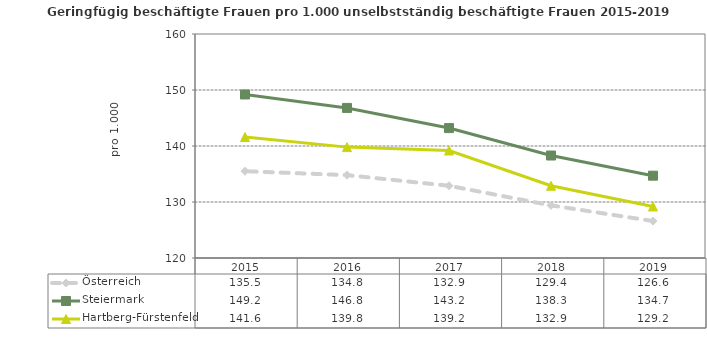
| Category | Österreich | Steiermark | Hartberg-Fürstenfeld |
|---|---|---|---|
| 2019.0 | 126.6 | 134.7 | 129.2 |
| 2018.0 | 129.4 | 138.3 | 132.9 |
| 2017.0 | 132.9 | 143.2 | 139.2 |
| 2016.0 | 134.8 | 146.8 | 139.8 |
| 2015.0 | 135.5 | 149.2 | 141.6 |